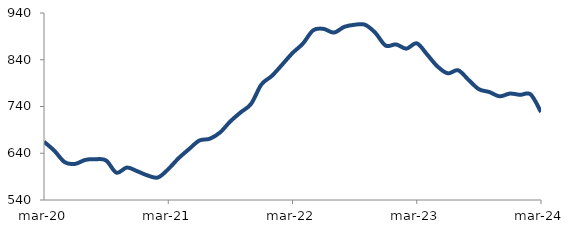
| Category | Series 0 |
|---|---|
| 2020-03-01 | 664.712 |
| 2020-04-01 | 645.351 |
| 2020-05-01 | 620.935 |
| 2020-06-01 | 617.256 |
| 2020-07-01 | 625.855 |
| 2020-08-01 | 627.288 |
| 2020-09-01 | 624.542 |
| 2020-10-01 | 598.351 |
| 2020-11-01 | 609.465 |
| 2020-12-01 | 601.605 |
| 2021-01-01 | 592.504 |
| 2021-02-01 | 588.185 |
| 2021-03-01 | 605.989 |
| 2021-04-01 | 629.446 |
| 2021-05-01 | 648.73 |
| 2021-06-01 | 667.177 |
| 2021-07-01 | 670.996 |
| 2021-08-01 | 684.389 |
| 2021-09-01 | 708.308 |
| 2021-10-01 | 727.608 |
| 2021-11-01 | 745.65 |
| 2021-12-01 | 787.184 |
| 2022-01-01 | 805.308 |
| 2022-02-01 | 829.502 |
| 2022-03-01 | 854.336 |
| 2022-04-01 | 874.453 |
| 2022-05-01 | 903.049 |
| 2022-06-01 | 906.022 |
| 2022-07-01 | 898.071 |
| 2022-08-01 | 910.353 |
| 2022-09-01 | 914.859 |
| 2022-10-01 | 914.857 |
| 2022-11-01 | 897.607 |
| 2022-12-01 | 870.196 |
| 2023-01-01 | 872.784 |
| 2023-02-01 | 863.736 |
| 2023-03-01 | 875.118 |
| 2023-04-01 | 851.276 |
| 2023-05-01 | 825.667 |
| 2023-06-01 | 810.924 |
| 2023-07-01 | 817.469 |
| 2023-08-01 | 797.001 |
| 2023-09-01 | 777.024 |
| 2023-10-01 | 770.975 |
| 2023-11-01 | 761.798 |
| 2023-12-01 | 767.626 |
| 2024-01-01 | 764.98 |
| 2024-02-01 | 765.887 |
| 2024-03-01 | 728.107 |